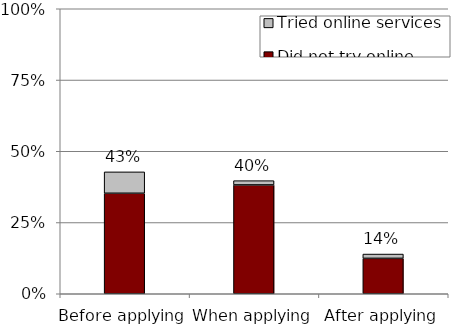
| Category | Did not try online services | Tried online services |
|---|---|---|
| Before applying | 0.353 | 0.075 |
| When applying | 0.382 | 0.015 |
| After applying | 0.124 | 0.015 |